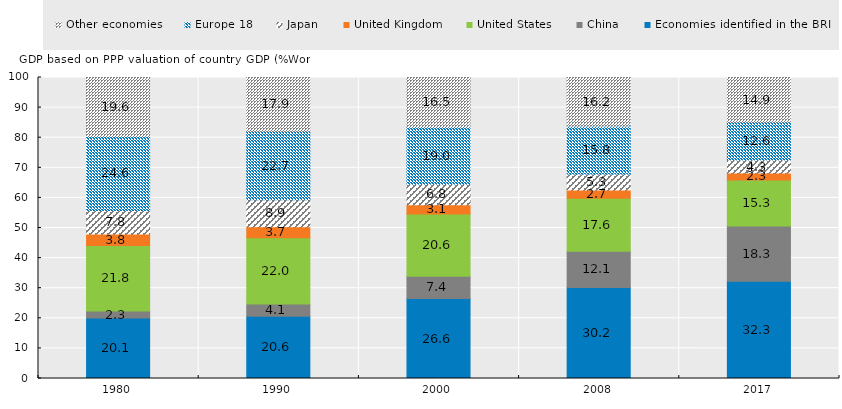
| Category | Economies identified in the BRI | China | United States | United Kingdom | Japan | Europe 18 | Other economies |
|---|---|---|---|---|---|---|---|
| 1980.0 | 20.091 | 2.328 | 21.784 | 3.794 | 7.816 | 24.612 | 19.575 |
| 1990.0 | 20.648 | 4.116 | 21.978 | 3.682 | 8.935 | 22.731 | 17.91 |
| 2000.0 | 26.556 | 7.421 | 20.637 | 3.122 | 6.833 | 18.978 | 16.453 |
| 2008.0 | 30.214 | 12.064 | 17.632 | 2.712 | 5.346 | 15.838 | 16.194 |
| 2017.0 | 32.344 | 18.308 | 15.327 | 2.293 | 4.278 | 12.563 | 14.886 |